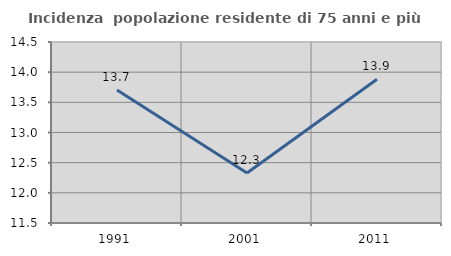
| Category | Incidenza  popolazione residente di 75 anni e più |
|---|---|
| 1991.0 | 13.703 |
| 2001.0 | 12.329 |
| 2011.0 | 13.882 |